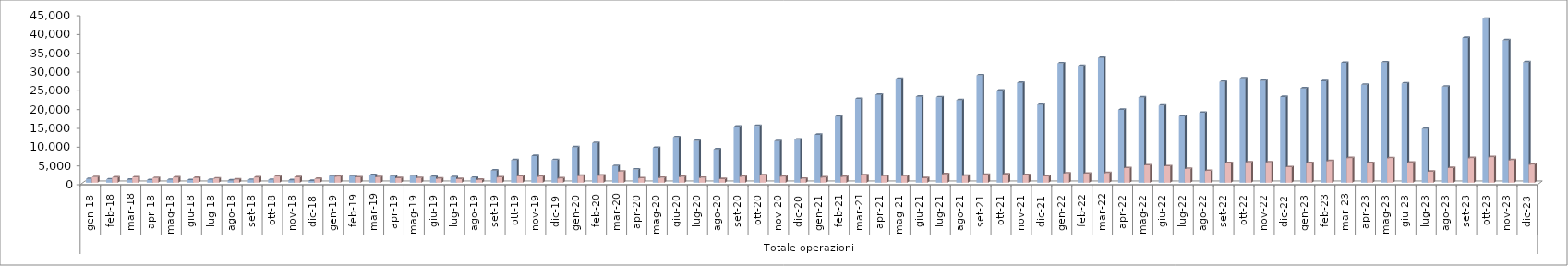
| Category | Series 0 | Series 1 |
|---|---|---|
| 0 | 996 | 1463 |
| 1 | 849 | 1374 |
| 2 | 765 | 1415 |
| 3 | 668 | 1245 |
| 4 | 737 | 1382 |
| 5 | 673 | 1258 |
| 6 | 732 | 1099 |
| 7 | 570 | 843 |
| 8 | 752 | 1388 |
| 9 | 752 | 1594 |
| 10 | 648 | 1454 |
| 11 | 466 | 1005 |
| 12 | 1741 | 1625 |
| 13 | 1745 | 1430 |
| 14 | 2021 | 1484 |
| 15 | 1730 | 1196 |
| 16 | 1790 | 1232 |
| 17 | 1559 | 1076 |
| 18 | 1484 | 963 |
| 19 | 1293 | 755 |
| 20 | 3217 | 1400 |
| 21 | 5987 | 1697 |
| 22 | 7090 | 1587 |
| 23 | 6030 | 1131 |
| 24 | 9451 | 1801 |
| 25 | 10561 | 1874 |
| 26 | 4442 | 2963 |
| 27 | 3496 | 1154 |
| 28 | 9296 | 1282 |
| 29 | 12120 | 1525 |
| 30 | 11135 | 1297 |
| 31 | 8877 | 955 |
| 32 | 14903 | 1592 |
| 33 | 15123 | 1971 |
| 34 | 11075 | 1637 |
| 35 | 11456 | 1038 |
| 36 | 12756 | 1373 |
| 37 | 17612 | 1579 |
| 38 | 22323 | 1951 |
| 39 | 23401 | 1754 |
| 40 | 27652 | 1762 |
| 41 | 22918 | 1212 |
| 42 | 22750 | 2248 |
| 43 | 21988 | 1811 |
| 44 | 28587 | 2089 |
| 45 | 24526 | 2173 |
| 46 | 26608 | 2017 |
| 47 | 20755 | 1690 |
| 48 | 31777 | 2455 |
| 49 | 31128 | 2403 |
| 50 | 33234 | 2539 |
| 51 | 19395 | 3881 |
| 52 | 22731 | 4626 |
| 53 | 20543 | 4376 |
| 54 | 17657 | 3675 |
| 55 | 18639 | 3129 |
| 56 | 26870 | 5225 |
| 57 | 27796 | 5426 |
| 58 | 27163 | 5403 |
| 59 | 22847 | 4132 |
| 60 | 25133 | 5222 |
| 61 | 27034 | 5742 |
| 62 | 31908 | 6560 |
| 63 | 26073 | 5242 |
| 64 | 32052 | 6534 |
| 65 | 26434 | 5320 |
| 66 | 14356 | 2917 |
| 67 | 25574 | 3894 |
| 68 | 38589 | 6540 |
| 69 | 43658 | 6792 |
| 70 | 37985 | 5985 |
| 71 | 32076 | 4809 |